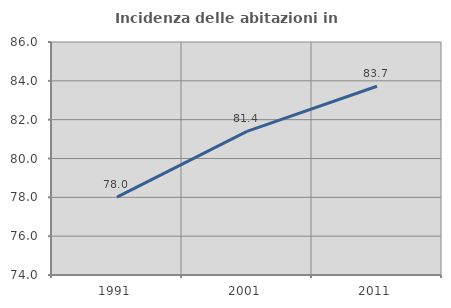
| Category | Incidenza delle abitazioni in proprietà  |
|---|---|
| 1991.0 | 78.014 |
| 2001.0 | 81.4 |
| 2011.0 | 83.721 |